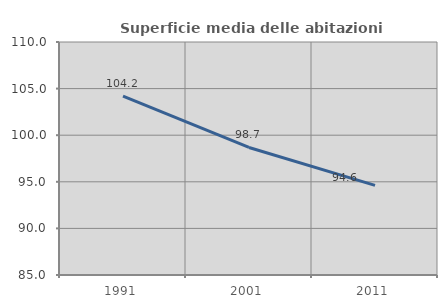
| Category | Superficie media delle abitazioni occupate |
|---|---|
| 1991.0 | 104.191 |
| 2001.0 | 98.686 |
| 2011.0 | 94.621 |